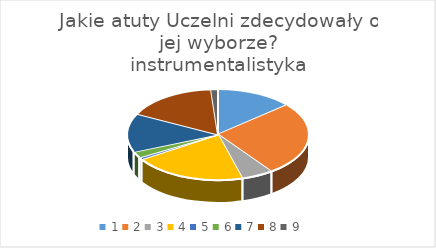
| Category | Series 0 |
|---|---|
| 0 | 56 |
| 1 | 107 |
| 2 | 23 |
| 3 | 82 |
| 4 | 3 |
| 5 | 9 |
| 6 | 56 |
| 7 | 66 |
| 8 | 5 |